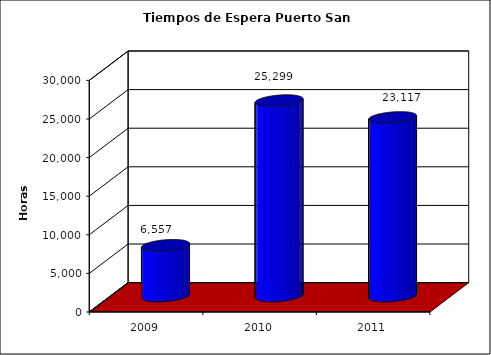
| Category | Series 0 |
|---|---|
| 2009.0 | 6557 |
| 2010.0 | 25299 |
| 2011.0 | 23117 |